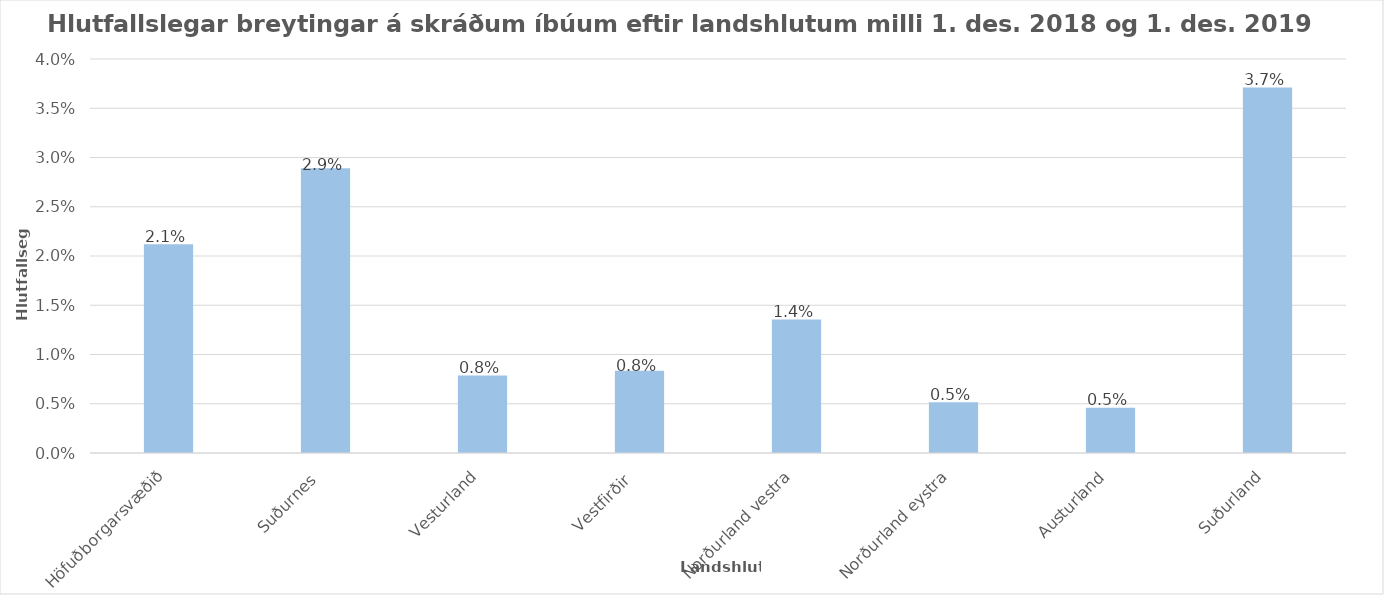
| Category | Series 0 |
|---|---|
| Höfuðborgarsvæðið | 0.021 |
| Suðurnes  | 0.029 |
| Vesturland | 0.008 |
| Vestfirðir  | 0.008 |
| Norðurland vestra | 0.014 |
| Norðurland eystra | 0.005 |
| Austurland | 0.005 |
| Suðurland | 0.037 |